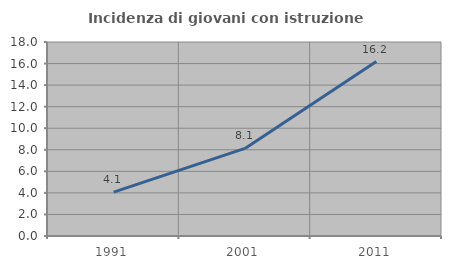
| Category | Incidenza di giovani con istruzione universitaria |
|---|---|
| 1991.0 | 4.065 |
| 2001.0 | 8.127 |
| 2011.0 | 16.187 |